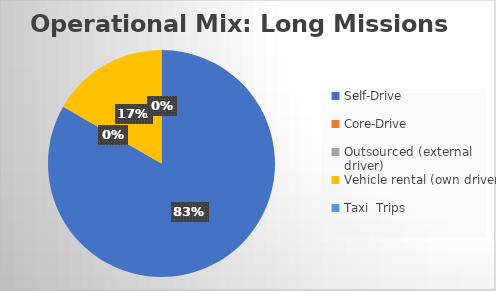
| Category | Series 0 |
|---|---|
| Self-Drive | 5 |
| Core-Drive | 0 |
| Outsourced (external driver) | 0 |
| Vehicle rental (own driver) | 1 |
| Taxi  Trips | 0 |